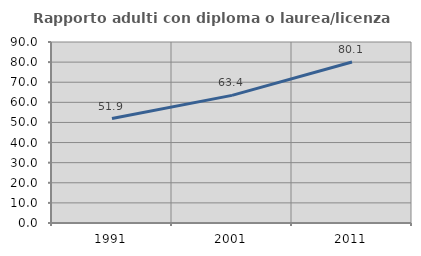
| Category | Rapporto adulti con diploma o laurea/licenza media  |
|---|---|
| 1991.0 | 51.929 |
| 2001.0 | 63.45 |
| 2011.0 | 80.082 |